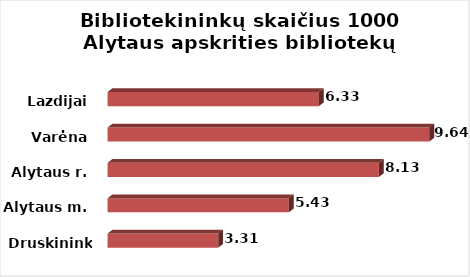
| Category | Series 0 |
|---|---|
| Druskininkai | 3.313 |
| Alytaus m. | 5.43 |
| Alytaus r. | 8.13 |
| Varėna | 9.64 |
| Lazdijai | 6.33 |